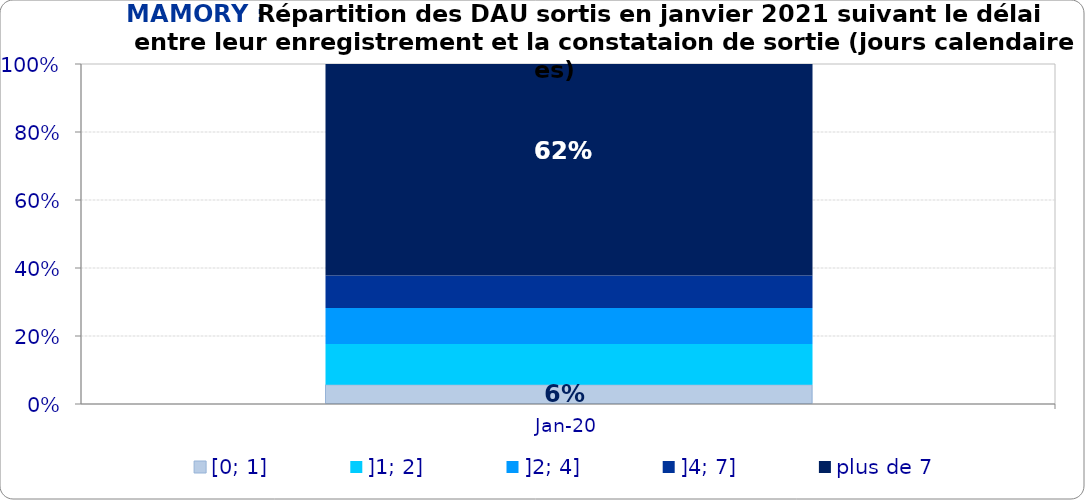
| Category | [0; 1] | ]1; 2] | ]2; 4] | ]4; 7] | plus de 7 |
|---|---|---|---|---|---|
| 2020-01-01 | 0.056 | 0.12 | 0.106 | 0.096 | 0.622 |